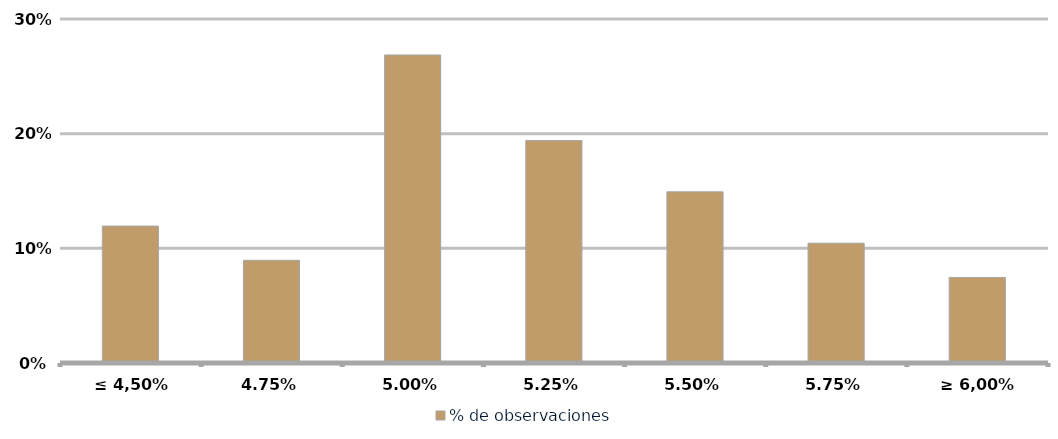
| Category | % de observaciones  |
|---|---|
| ≤ 4,50% | 0.119 |
| 4,75% | 0.09 |
| 5,00% | 0.269 |
| 5,25% | 0.194 |
| 5,50% | 0.149 |
| 5,75% | 0.104 |
| ≥ 6,00% | 0.075 |